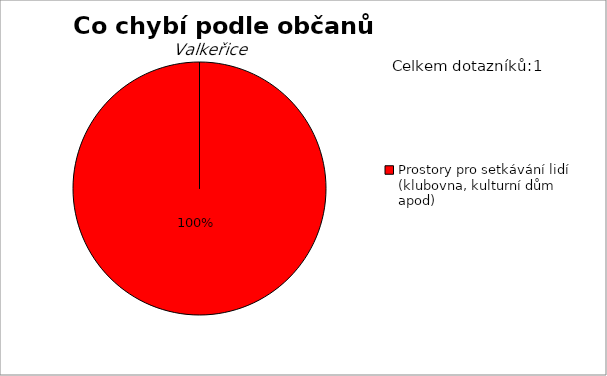
| Category | Series 0 |
|---|---|
| Prostory pro setkávání lidí (klubovna, kulturní dům apod) | 1 |